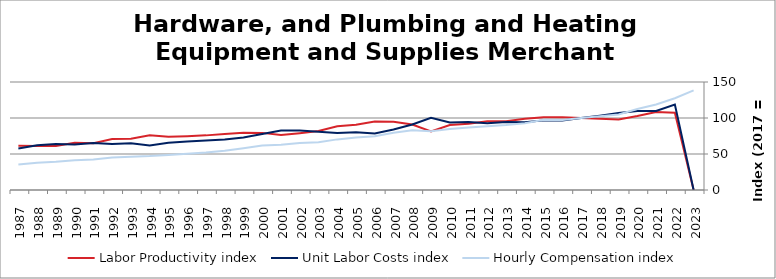
| Category | Labor Productivity index | Unit Labor Costs index | Hourly Compensation index |
|---|---|---|---|
| 2023.0 | 0 | 0 | 138.355 |
| 2022.0 | 107.248 | 118.816 | 127.427 |
| 2021.0 | 108.231 | 109.698 | 118.727 |
| 2020.0 | 102.678 | 109.586 | 112.52 |
| 2019.0 | 97.984 | 106.901 | 104.746 |
| 2018.0 | 99.074 | 103.276 | 102.319 |
| 2017.0 | 100 | 100 | 100 |
| 2016.0 | 100.914 | 96.395 | 97.276 |
| 2015.0 | 100.873 | 96.695 | 97.539 |
| 2014.0 | 98.815 | 93.958 | 92.844 |
| 2013.0 | 95.449 | 94.427 | 90.13 |
| 2012.0 | 95.35 | 92.829 | 88.513 |
| 2011.0 | 91.964 | 94.481 | 86.889 |
| 2010.0 | 90.142 | 93.863 | 84.61 |
| 2009.0 | 81.411 | 100.355 | 81.7 |
| 2008.0 | 90.947 | 91.067 | 82.823 |
| 2007.0 | 94.764 | 83.978 | 79.581 |
| 2006.0 | 95.131 | 78.614 | 74.786 |
| 2005.0 | 90.686 | 80.252 | 72.777 |
| 2004.0 | 88.663 | 79.289 | 70.3 |
| 2003.0 | 81.933 | 81.038 | 66.397 |
| 2002.0 | 78.849 | 82.632 | 65.155 |
| 2001.0 | 76.24 | 82.52 | 62.913 |
| 2000.0 | 79.335 | 77.729 | 61.666 |
| 1999.0 | 79.609 | 72.835 | 57.983 |
| 1998.0 | 77.838 | 70.233 | 54.668 |
| 1997.0 | 75.87 | 68.633 | 52.071 |
| 1996.0 | 74.773 | 67.506 | 50.476 |
| 1995.0 | 73.956 | 65.587 | 48.506 |
| 1994.0 | 76.132 | 61.86 | 47.095 |
| 1993.0 | 71.268 | 64.994 | 46.32 |
| 1992.0 | 70.717 | 63.885 | 45.177 |
| 1991.0 | 64.827 | 65.414 | 42.406 |
| 1990.0 | 65.662 | 63.057 | 41.405 |
| 1989.0 | 61.18 | 63.892 | 39.089 |
| 1988.0 | 61.078 | 62.152 | 37.961 |
| 1987.0 | 61.444 | 57.672 | 35.436 |